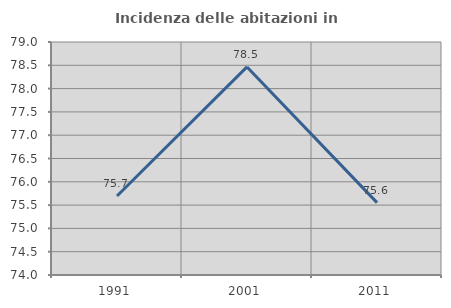
| Category | Incidenza delle abitazioni in proprietà  |
|---|---|
| 1991.0 | 75.696 |
| 2001.0 | 78.465 |
| 2011.0 | 75.553 |